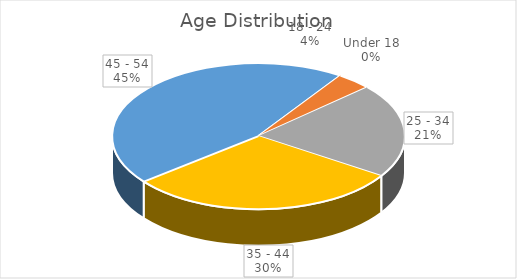
| Category | Series 0 |
|---|---|
| Under 18 | 0 |
| 18 - 24 | 8 |
| 25 - 34 | 43 |
| 35 - 44 | 62 |
| 45 - 54 | 93 |